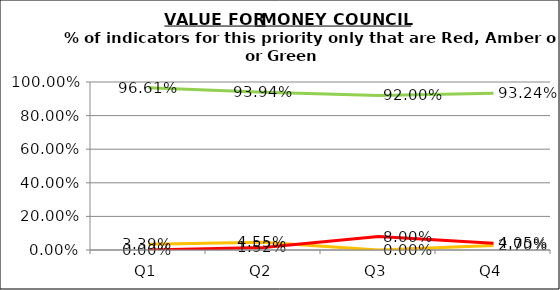
| Category | Green | Amber | Red |
|---|---|---|---|
| Q1 | 0.966 | 0.034 | 0 |
| Q2 | 0.939 | 0.045 | 0.015 |
| Q3 | 0.92 | 0 | 0.08 |
| Q4 | 0.932 | 0.027 | 0.041 |